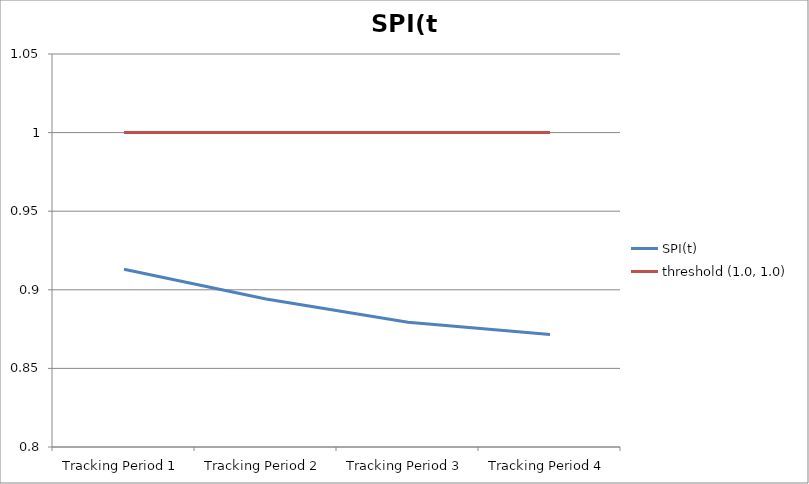
| Category | SPI(t) | threshold (1.0, 1.0) |
|---|---|---|
| Tracking Period 1 | 0.913 | 1 |
| Tracking Period 2 | 0.894 | 1 |
| Tracking Period 3 | 0.879 | 1 |
| Tracking Period 4 | 0.872 | 1 |